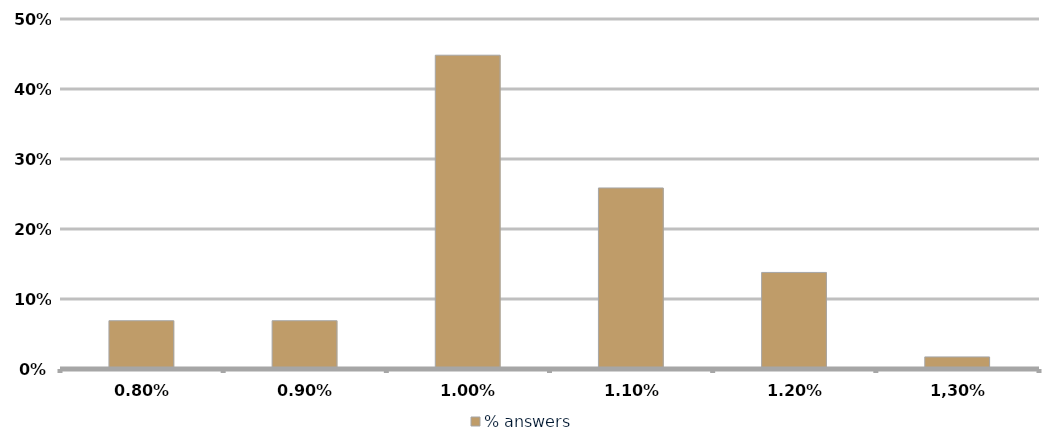
| Category | % answers |
|---|---|
| 0,80% | 0.069 |
| 0,90% | 0.069 |
| 1,00% | 0.448 |
| 1,10% | 0.259 |
| 1,20% | 0.138 |
| 1,30% | 0.017 |